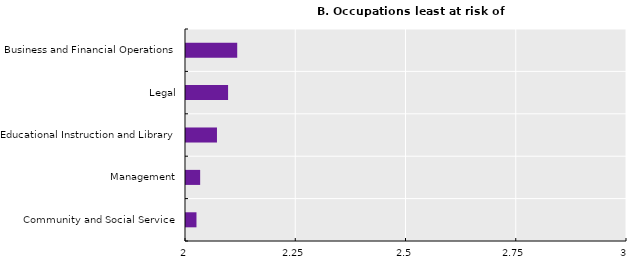
| Category | Series 0 |
|---|---|
| Community and Social Service | 2.024 |
| Management | 2.032 |
| Educational Instruction and Library | 2.07 |
| Legal | 2.095 |
| Business and Financial Operations | 2.116 |